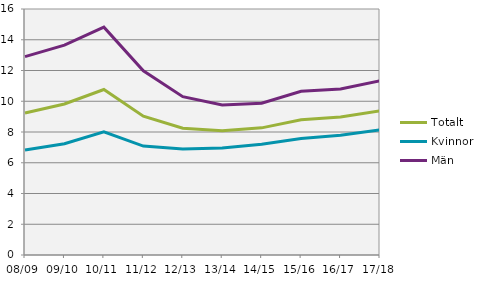
| Category | Totalt  | Kvinnor  | Män |
|---|---|---|---|
| 08/09 | 9.23 | 6.83 | 12.9 |
| 09/10 | 9.823 | 7.241 | 13.651 |
| 10/11 | 10.765 | 8.008 | 14.82 |
| 11/12 | 9.031 | 7.084 | 11.982 |
| 12/13 | 8.241 | 6.894 | 10.298 |
| 13/14 | 8.078 | 6.963 | 9.764 |
| 14/15 | 8.269 | 7.206 | 9.868 |
| 15/16 | 8.796 | 7.581 | 10.644 |
| 16/17 | 8.972 | 7.783 | 10.798 |
| 17/18 | 9.379 | 8.137 | 11.327 |